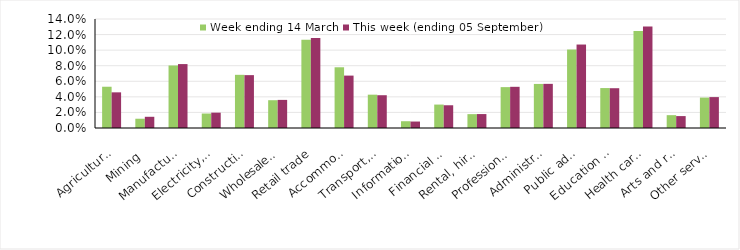
| Category | Week ending 14 March | This week (ending 05 September) |
|---|---|---|
| Agriculture, forestry and fishing | 0.053 | 0.046 |
| Mining | 0.012 | 0.014 |
| Manufacturing | 0.08 | 0.082 |
| Electricity, gas, water and waste services | 0.019 | 0.02 |
| Construction | 0.068 | 0.068 |
| Wholesale trade | 0.036 | 0.036 |
| Retail trade | 0.113 | 0.116 |
| Accommodation and food services | 0.078 | 0.067 |
| Transport, postal and warehousing | 0.043 | 0.042 |
| Information media and telecommunications | 0.009 | 0.008 |
| Financial and insurance services | 0.03 | 0.029 |
| Rental, hiring and real estate services | 0.018 | 0.018 |
| Professional, scientific and technical services | 0.052 | 0.053 |
| Administrative and support services | 0.057 | 0.057 |
| Public administration and safety | 0.101 | 0.107 |
| Education and training | 0.051 | 0.051 |
| Health care and social assistance | 0.125 | 0.13 |
| Arts and recreation services | 0.016 | 0.015 |
| Other services | 0.039 | 0.04 |